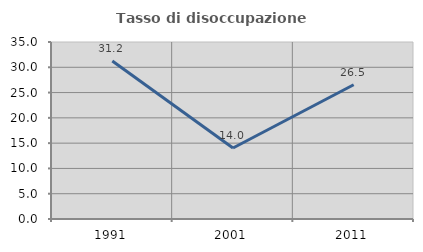
| Category | Tasso di disoccupazione giovanile  |
|---|---|
| 1991.0 | 31.233 |
| 2001.0 | 14.041 |
| 2011.0 | 26.542 |